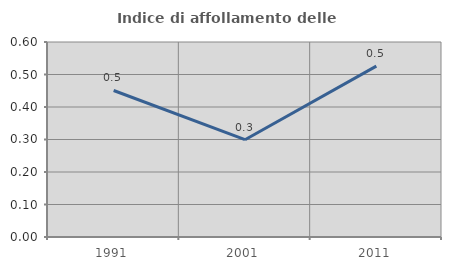
| Category | Indice di affollamento delle abitazioni  |
|---|---|
| 1991.0 | 0.451 |
| 2001.0 | 0.299 |
| 2011.0 | 0.526 |